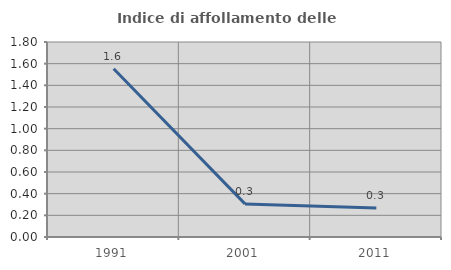
| Category | Indice di affollamento delle abitazioni  |
|---|---|
| 1991.0 | 1.554 |
| 2001.0 | 0.306 |
| 2011.0 | 0.268 |